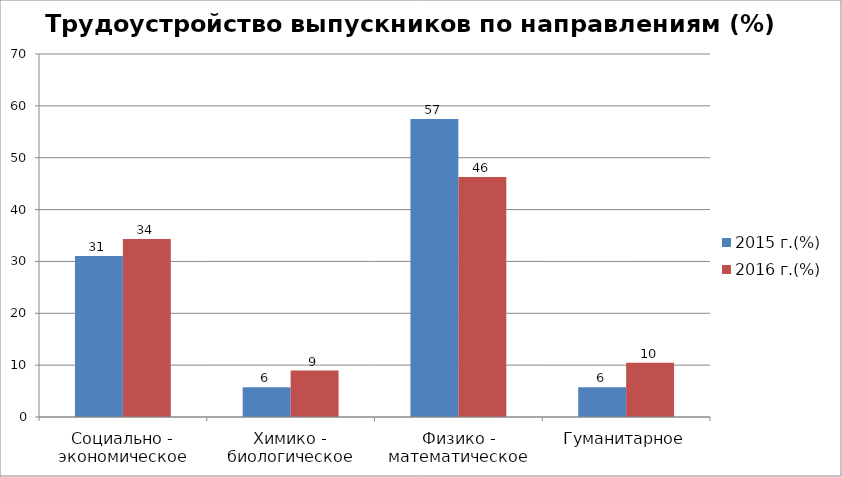
| Category | 2015 г.(%) | 2016 г.(%) |
|---|---|---|
| Социально - экономическое | 31.034 | 34.328 |
| Химико - биологическое | 5.747 | 8.955 |
| Физико - математическое | 57.471 | 46.269 |
| Гуманитарное | 5.747 | 10.448 |